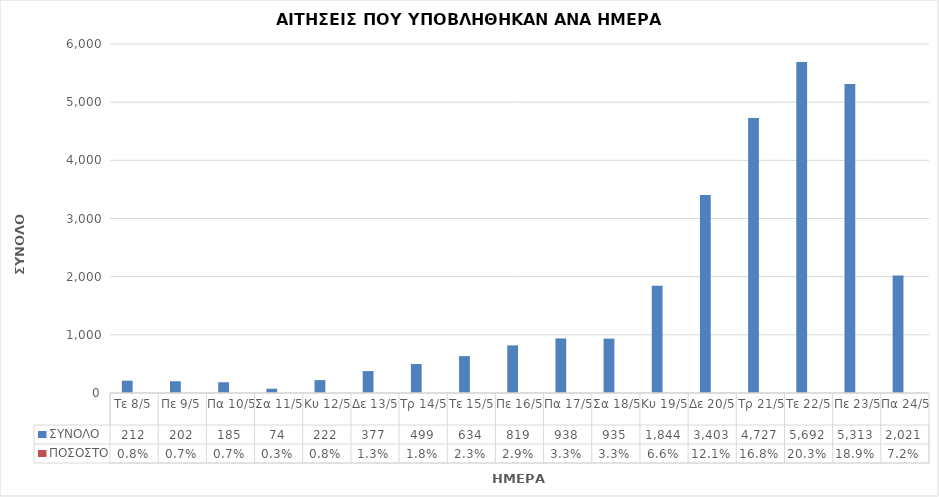
| Category | ΣΥΝΟΛΟ | ΠΟΣΟΣΤΟ |
|---|---|---|
| Τε 8/5 | 212 | 0.008 |
| Πε 9/5 | 202 | 0.007 |
| Πα 10/5 | 185 | 0.007 |
| Σα 11/5 | 74 | 0.003 |
| Κυ 12/5 | 222 | 0.008 |
| Δε 13/5 | 377 | 0.013 |
| Τρ 14/5 | 499 | 0.018 |
| Τε 15/5 | 634 | 0.023 |
| Πε 16/5 | 819 | 0.029 |
| Πα 17/5 | 938 | 0.033 |
| Σα 18/5 | 935 | 0.033 |
| Κυ 19/5 | 1844 | 0.066 |
| Δε 20/5 | 3403 | 0.121 |
| Τρ 21/5 | 4727 | 0.168 |
| Τε 22/5 | 5692 | 0.203 |
| Πε 23/5 | 5313 | 0.189 |
| Πα 24/5 | 2021 | 0.072 |